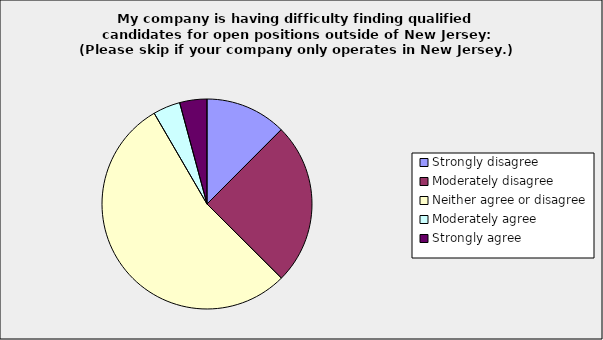
| Category | Series 0 |
|---|---|
| Strongly disagree | 0.125 |
| Moderately disagree | 0.25 |
| Neither agree or disagree | 0.542 |
| Moderately agree | 0.042 |
| Strongly agree | 0.042 |